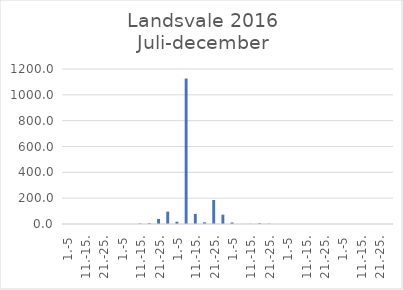
| Category | Series 0 |
|---|---|
| 1.-5 | 0 |
| 6.-10. | 0.116 |
| 11.-15. | 0 |
| 16.-20. | 0.34 |
| 21.-25. | 0 |
| 26.-31. | 0 |
| 1.-5 | 0 |
| 6.-10. | 0.11 |
| 11.-15. | 3.798 |
| 16.-20. | 6 |
| 21.-25. | 39.368 |
| 26.-31. | 95.701 |
| 1.-5 | 17.376 |
| 6.-10. | 1126.233 |
| 11.-15. | 78.255 |
| 16.-20. | 12.997 |
| 21.-25. | 185.864 |
| 26.-30. | 72.211 |
| 1.-5 | 11.878 |
| 6.-10. | 0.482 |
| 11.-15. | 1.294 |
| 16.-20. | 5.958 |
| 21.-25. | 2.066 |
| 26.-31. | 0.072 |
| 1.-5 | 0.023 |
| 6.-10. | 0 |
| 11.-15. | 0 |
| 16.-20. | 0 |
| 21.-25. | 0 |
| 26.-30. | 0 |
| 1.-5 | 0 |
| 6.-10. | 0 |
| 11.-15. | 0 |
| 16.-20. | 0 |
| 21.-25. | 0 |
| 26.-31. | 0 |